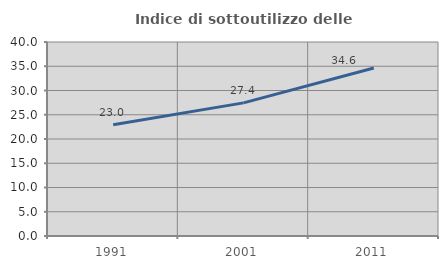
| Category | Indice di sottoutilizzo delle abitazioni  |
|---|---|
| 1991.0 | 22.959 |
| 2001.0 | 27.446 |
| 2011.0 | 34.642 |